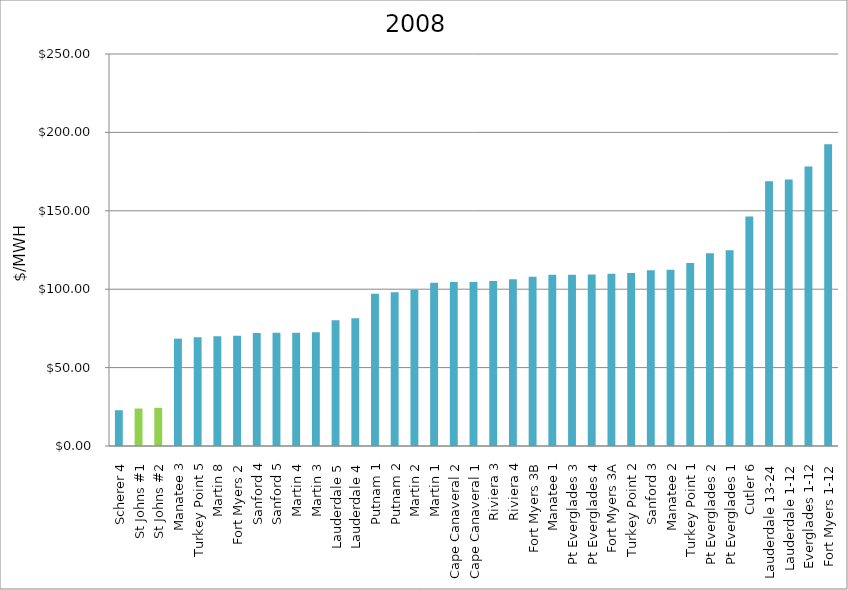
| Category | $/MWH |
|---|---|
| Scherer 4 | 22.811 |
| St Johns #1 | 23.891 |
| St Johns #2 | 24.359 |
| Manatee 3 | 68.466 |
| Turkey Point 5 | 69.434 |
| Martin 8 | 69.991 |
| Fort Myers 2 | 70.323 |
| Sanford 4 | 72.132 |
| Sanford 5 | 72.2 |
| Martin 4 | 72.239 |
| Martin 3 | 72.562 |
| Lauderdale 5 | 80.167 |
| Lauderdale 4 | 81.447 |
| Putnam 1 | 97.078 |
| Putnam 2 | 97.977 |
| Martin 2 | 99.639 |
| Martin 1 | 104.084 |
| Cape Canaveral 2 | 104.66 |
| Cape Canaveral 1 | 104.664 |
| Riviera 3 | 105.214 |
| Riviera 4 | 106.41 |
| Fort Myers 3B | 107.87 |
| Manatee 1 | 109.158 |
| Pt Everglades 3 | 109.264 |
| Pt Everglades 4 | 109.383 |
| Fort Myers 3A | 109.874 |
| Turkey Point 2 | 110.299 |
| Sanford 3 | 112.036 |
| Manatee 2 | 112.407 |
| Turkey Point 1 | 116.696 |
| Pt Everglades 2 | 122.95 |
| Pt Everglades 1 | 124.77 |
| Cutler 6 | 146.414 |
| Lauderdale 13-24 | 168.916 |
| Lauderdale 1-12 | 169.884 |
| Everglades 1-12 | 178.228 |
| Fort Myers 1-12 | 192.431 |